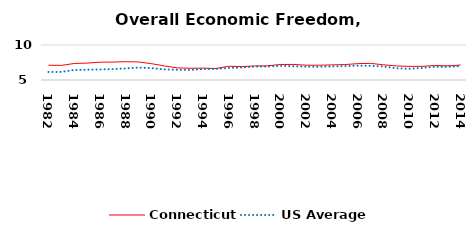
| Category | Connecticut | US Average |
|---|---|---|
| 1982.0 | 7.111 | 6.149 |
| 1983.0 | 7.087 | 6.152 |
| 1984.0 | 7.358 | 6.429 |
| 1985.0 | 7.416 | 6.464 |
| 1986.0 | 7.542 | 6.512 |
| 1987.0 | 7.562 | 6.552 |
| 1988.0 | 7.612 | 6.659 |
| 1989.0 | 7.576 | 6.767 |
| 1990.0 | 7.334 | 6.71 |
| 1991.0 | 7.009 | 6.502 |
| 1992.0 | 6.73 | 6.463 |
| 1993.0 | 6.68 | 6.446 |
| 1994.0 | 6.695 | 6.563 |
| 1995.0 | 6.642 | 6.593 |
| 1996.0 | 6.967 | 6.73 |
| 1997.0 | 6.916 | 6.781 |
| 1998.0 | 7.006 | 6.926 |
| 1999.0 | 7.019 | 6.925 |
| 2000.0 | 7.214 | 7.031 |
| 2001.0 | 7.225 | 6.969 |
| 2002.0 | 7.116 | 6.912 |
| 2003.0 | 7.111 | 6.892 |
| 2004.0 | 7.16 | 6.934 |
| 2005.0 | 7.201 | 6.99 |
| 2006.0 | 7.335 | 7.048 |
| 2007.0 | 7.376 | 7.028 |
| 2008.0 | 7.173 | 6.935 |
| 2009.0 | 7.008 | 6.668 |
| 2010.0 | 6.943 | 6.605 |
| 2011.0 | 6.953 | 6.72 |
| 2012.0 | 7.067 | 6.883 |
| 2013.0 | 7.021 | 6.881 |
| 2014.0 | 7.143 | 6.973 |